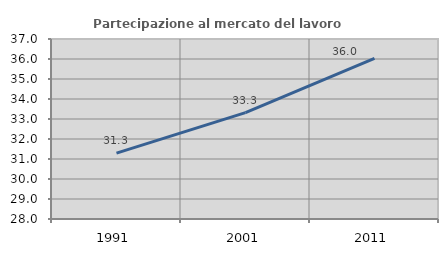
| Category | Partecipazione al mercato del lavoro  femminile |
|---|---|
| 1991.0 | 31.293 |
| 2001.0 | 33.315 |
| 2011.0 | 36.033 |